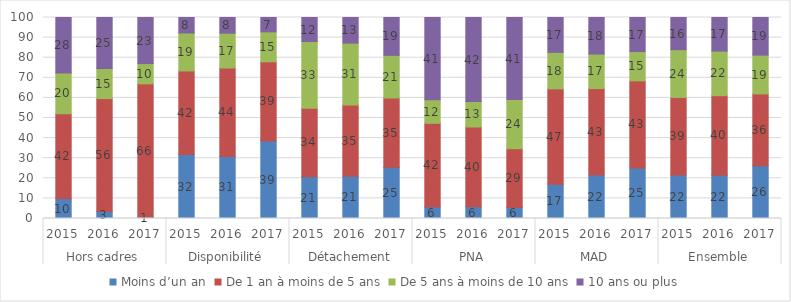
| Category | Moins d’un an | De 1 an à moins de 5 ans | De 5 ans à moins de 10 ans | 10 ans ou plus |
|---|---|---|---|---|
| 0 | 9.859 | 42.254 | 20.282 | 27.606 |
| 1 | 3.454 | 56.201 | 14.914 | 25.432 |
| 2 | 0.604 | 66.398 | 10.06 | 22.938 |
| 3 | 31.783 | 41.631 | 18.867 | 7.719 |
| 4 | 30.883 | 44.012 | 17.311 | 7.795 |
| 5 | 38.612 | 39.327 | 14.917 | 7.145 |
| 6 | 20.776 | 34.129 | 33.138 | 11.957 |
| 7 | 21.066 | 35.411 | 30.759 | 12.764 |
| 8 | 25.369 | 34.574 | 21.22 | 18.837 |
| 9 | 5.763 | 41.593 | 11.662 | 40.982 |
| 10 | 5.894 | 39.644 | 12.64 | 41.822 |
| 11 | 5.526 | 29.2 | 24.438 | 40.837 |
| 12 | 17.078 | 47.417 | 18.14 | 17.365 |
| 13 | 21.638 | 42.994 | 17.164 | 18.205 |
| 14 | 25.17 | 43.298 | 14.577 | 16.955 |
| 15 | 21.67 | 38.559 | 23.755 | 16.016 |
| 16 | 21.54 | 39.557 | 22.175 | 16.728 |
| 17 | 26.274 | 35.707 | 19.295 | 18.724 |